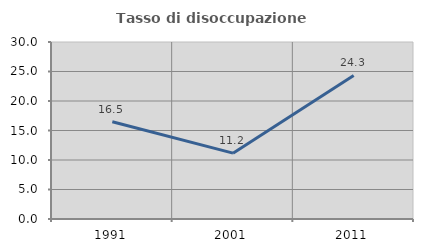
| Category | Tasso di disoccupazione giovanile  |
|---|---|
| 1991.0 | 16.479 |
| 2001.0 | 11.161 |
| 2011.0 | 24.324 |